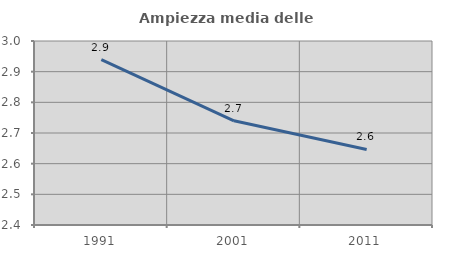
| Category | Ampiezza media delle famiglie |
|---|---|
| 1991.0 | 2.939 |
| 2001.0 | 2.74 |
| 2011.0 | 2.646 |